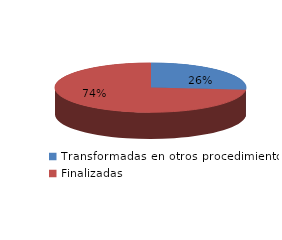
| Category | Series 0 |
|---|---|
| Transformadas en otros procedimientos | 4585 |
| Finalizadas | 12766 |